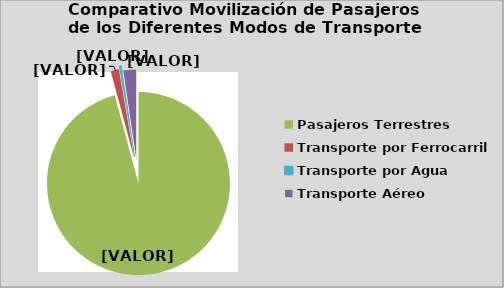
| Category | Series 0 |
|---|---|
| Pasajeros Terrestres | 95.773 |
| Transporte por Ferrocarril | 1.456 |
| Transporte por Agua | 0.4 |
| Transporte Aéreo | 2.32 |